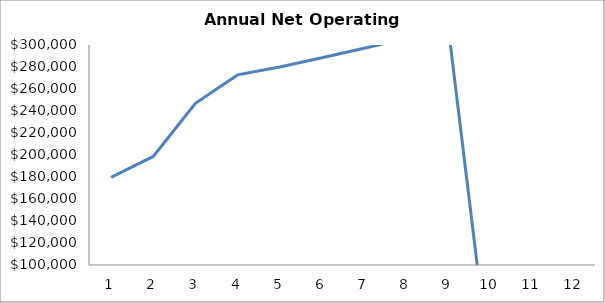
| Category | Series 0 |
|---|---|
| 0 | 179714.173 |
| 1 | 198690.623 |
| 2 | 246984.491 |
| 3 | 272830.055 |
| 4 | 279935.387 |
| 5 | 288333.449 |
| 6 | 296983.452 |
| 7 | 305892.956 |
| 8 | 315069.745 |
| 9 | 0 |
| 10 | 0 |
| 11 | 0 |